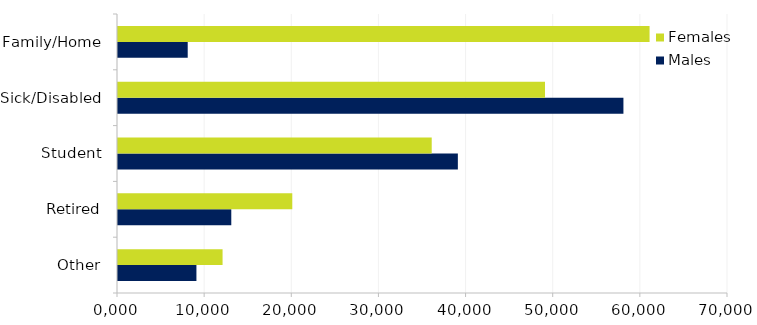
| Category | Males | Females |
|---|---|---|
| Other | 9000 | 12000 |
| Retired | 13000 | 20000 |
| Student | 39000 | 36000 |
| Sick/Disabled | 58000 | 49000 |
| Family/Home | 8000 | 61000 |